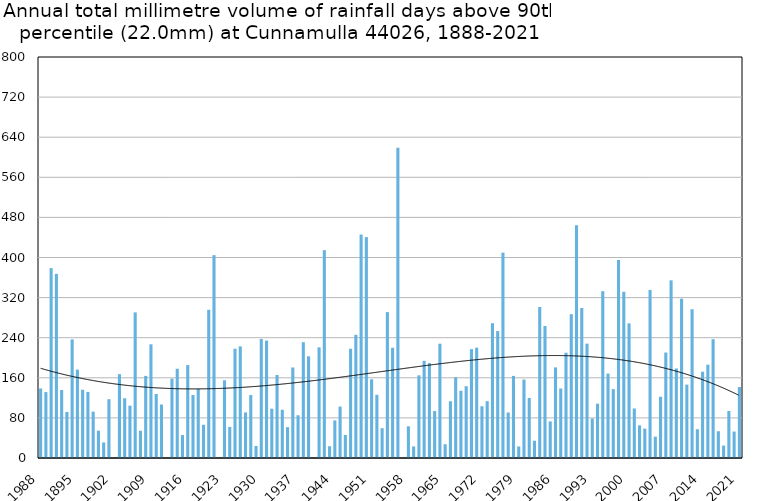
| Category | Annual total mm in days above 90th percentile |
|---|---|
| 1988 | 138.7 |
| 1889 | 131.5 |
| 1890 | 378.8 |
| 1891 | 367.4 |
| 1892 | 135.6 |
| 1893 | 91.9 |
| 1894 | 236.6 |
| 1895 | 176.3 |
| 1896 | 136.2 |
| 1897 | 131.9 |
| 1898 | 92.5 |
| 1899 | 54.6 |
| 1900 | 31 |
| 1901 | 117.3 |
| 1902 | 0 |
| 1903 | 167.3 |
| 1904 | 119.2 |
| 1905 | 104.4 |
| 1906 | 290.5 |
| 1907 | 54.4 |
| 1908 | 163.8 |
| 1909 | 226.8 |
| 1910 | 127.7 |
| 1911 | 106.7 |
| 1912 | 0 |
| 1913 | 158.3 |
| 1914 | 178.1 |
| 1915 | 45.7 |
| 1916 | 185.4 |
| 1917 | 125.6 |
| 1918 | 137.9 |
| 1919 | 66.3 |
| 1920 | 295.7 |
| 1921 | 404.7 |
| 1922 | 0 |
| 1923 | 155 |
| 1924 | 62 |
| 1925 | 217.9 |
| 1926 | 222.7 |
| 1927 | 90.9 |
| 1928 | 125.7 |
| 1929 | 24.1 |
| 1930 | 237.5 |
| 1931 | 234.3 |
| 1932 | 98.3 |
| 1933 | 165.7 |
| 1934 | 96.3 |
| 1935 | 61.5 |
| 1936 | 180.6 |
| 1937 | 85.3 |
| 1938 | 231 |
| 1939 | 202.9 |
| 1940 | 0 |
| 1941 | 220.8 |
| 1942 | 414.7 |
| 1943 | 23.4 |
| 1944 | 75 |
| 1945 | 102.6 |
| 1946 | 46 |
| 1947 | 217.9 |
| 1948 | 245.7 |
| 1949 | 445.8 |
| 1950 | 440.7 |
| 1951 | 157 |
| 1952 | 126 |
| 1953 | 59.4 |
| 1954 | 291 |
| 1955 | 220 |
| 1956 | 619 |
| 1957 | 0 |
| 1958 | 63.3 |
| 1959 | 23.1 |
| 1960 | 164.9 |
| 1961 | 193.8 |
| 1962 | 189.3 |
| 1963 | 93.7 |
| 1964 | 228.1 |
| 1965 | 27.4 |
| 1966 | 113.2 |
| 1967 | 161 |
| 1968 | 134.1 |
| 1969 | 143.2 |
| 1970 | 217.2 |
| 1971 | 220.2 |
| 1972 | 103.2 |
| 1973 | 113.3 |
| 1974 | 268.9 |
| 1975 | 253.2 |
| 1976 | 409.7 |
| 1977 | 90.8 |
| 1978 | 163.8 |
| 1979 | 23 |
| 1980 | 156.6 |
| 1981 | 119.7 |
| 1982 | 34.4 |
| 1983 | 301.2 |
| 1984 | 263.4 |
| 1985 | 73 |
| 1986 | 180.8 |
| 1987 | 138.6 |
| 1988 | 210 |
| 1989 | 287 |
| 1990 | 464.4 |
| 1991 | 299.2 |
| 1992 | 228.2 |
| 1993 | 78.6 |
| 1994 | 108.4 |
| 1995 | 332.8 |
| 1996 | 168.4 |
| 1997 | 137.4 |
| 1998 | 394.8 |
| 1999 | 331.6 |
| 2000 | 268.6 |
| 2001 | 98.8 |
| 2002 | 65.1 |
| 2003 | 58.6 |
| 2004 | 335.3 |
| 2005 | 42.6 |
| 2006 | 122.2 |
| 2007 | 210.4 |
| 2008 | 354.4 |
| 2009 | 178.6 |
| 2010 | 317.8 |
| 2011 | 146.4 |
| 2012 | 296.8 |
| 2013 | 57.4 |
| 2014 | 172.2 |
| 2015 | 186.2 |
| 2016 | 237 |
| 2017 | 53.4 |
| 2018 | 24.8 |
| 2019 | 93.8 |
| 2020 | 52.8 |
| 2021 | 141.6 |